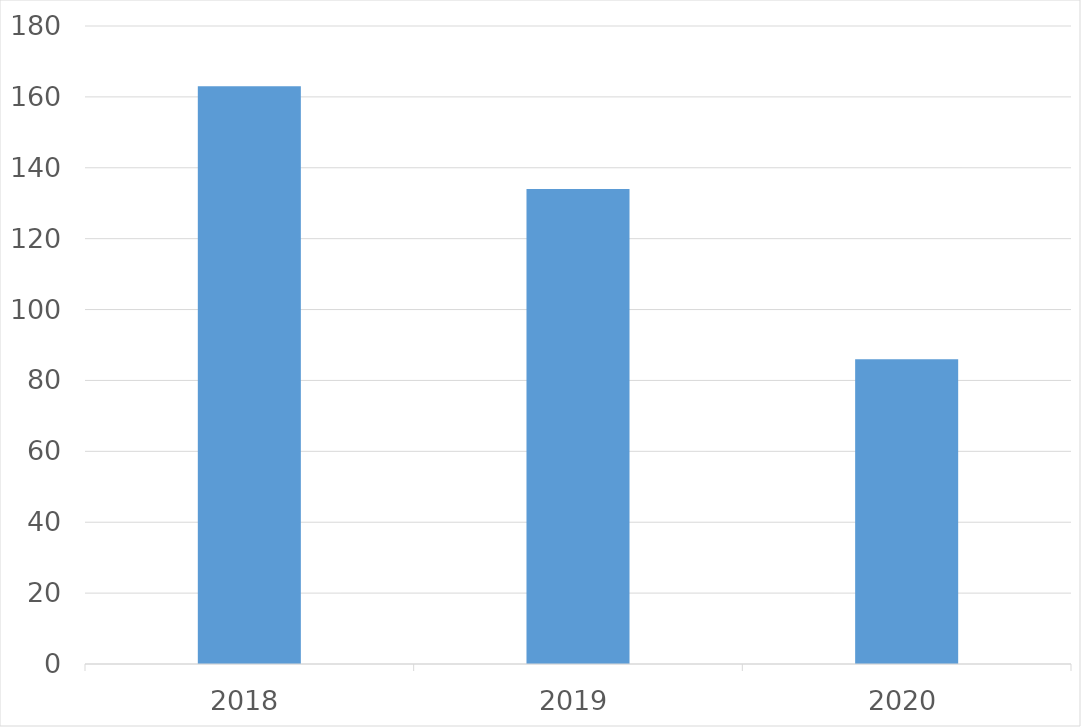
| Category | Series 0 |
|---|---|
| 2018 | 163 |
| 2019 | 134 |
| 2020 | 86 |